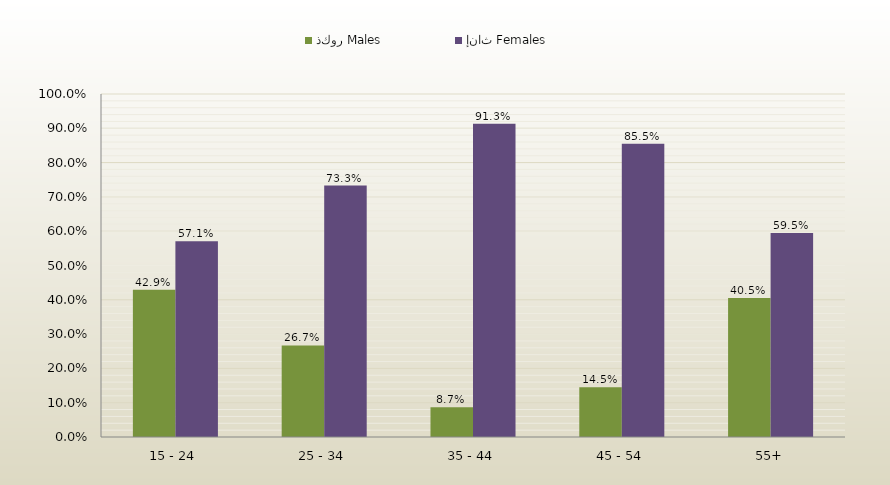
| Category | ذكور Males | إناث Females |
|---|---|---|
| 15 - 24 | 0.429 | 0.571 |
| 25 - 34 | 0.267 | 0.733 |
| 35 - 44 | 0.087 | 0.913 |
| 45 - 54 | 0.145 | 0.855 |
| 55+ | 0.405 | 0.595 |